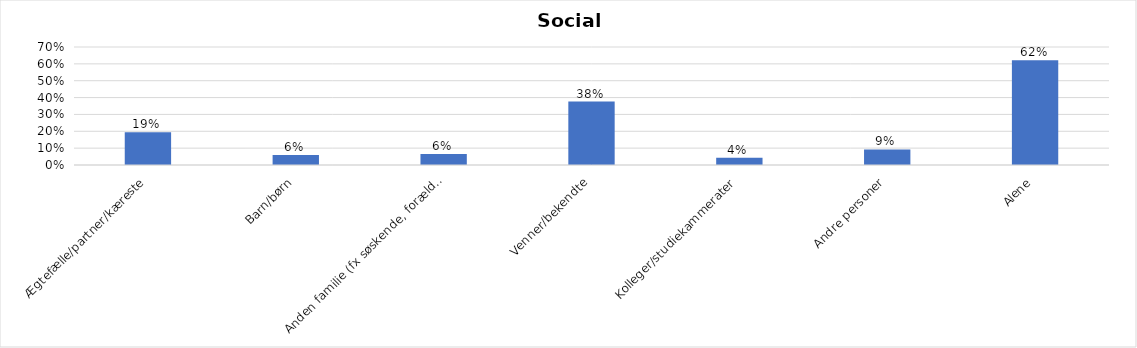
| Category | % |
|---|---|
| Ægtefælle/partner/kæreste | 0.194 |
| Barn/børn | 0.059 |
| Anden familie (fx søskende, forældre) | 0.065 |
| Venner/bekendte | 0.377 |
| Kolleger/studiekammerater | 0.043 |
| Andre personer | 0.092 |
| Alene | 0.622 |